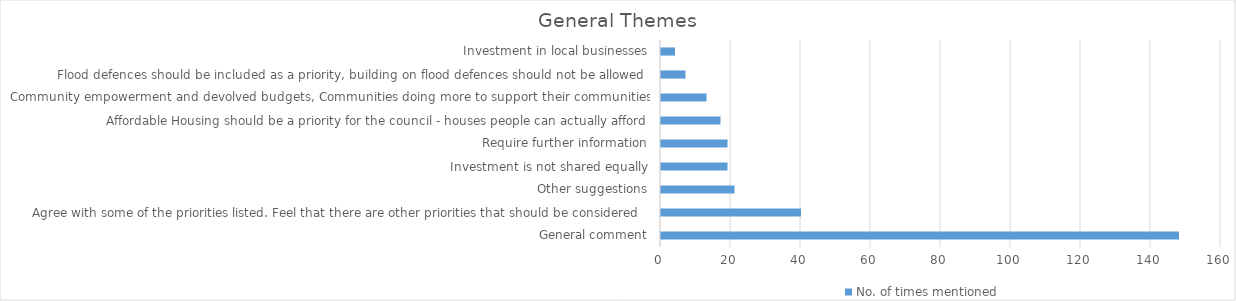
| Category | No. of times mentioned |
|---|---|
| General comment | 148 |
| Agree with some of the priorities listed. Feel that there are other priorities that should be considered   | 40 |
| Other suggestions | 21 |
| Investment is not shared equally | 19 |
| Require further information | 19 |
| Affordable Housing should be a priority for the council - houses people can actually afford | 17 |
| Community empowerment and devolved budgets, Communities doing more to support their communities | 13 |
| Flood defences should be included as a priority, building on flood defences should not be allowed  | 7 |
| Investment in local businesses | 4 |